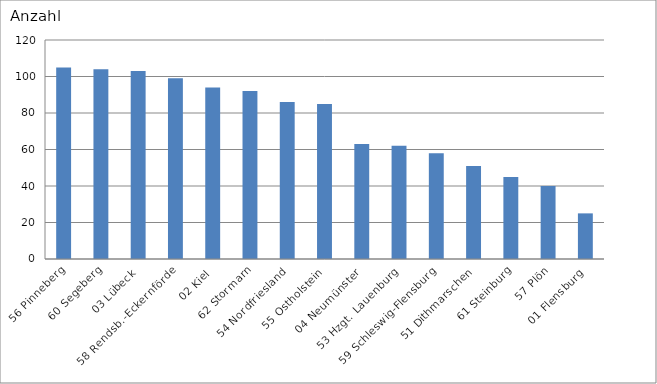
| Category | 56 Pinneberg 60 Segeberg 03 Lübeck 58 Rendsb.-Eckernförde 02 Kiel 62 Stormarn 54 Nordfriesland 55 Ostholstein 04 Neumünster 53 Hzgt. Lauenburg 59 Schleswig-Flensburg 51 Dithmarschen 61 Steinburg 57 Plön 01 Flensburg |
|---|---|
| 56 Pinneberg | 105 |
| 60 Segeberg | 104 |
| 03 Lübeck | 103 |
| 58 Rendsb.-Eckernförde | 99 |
| 02 Kiel | 94 |
| 62 Stormarn | 92 |
| 54 Nordfriesland | 86 |
| 55 Ostholstein | 85 |
| 04 Neumünster | 63 |
| 53 Hzgt. Lauenburg | 62 |
| 59 Schleswig-Flensburg | 58 |
| 51 Dithmarschen | 51 |
| 61 Steinburg | 45 |
| 57 Plön | 40 |
| 01 Flensburg | 25 |